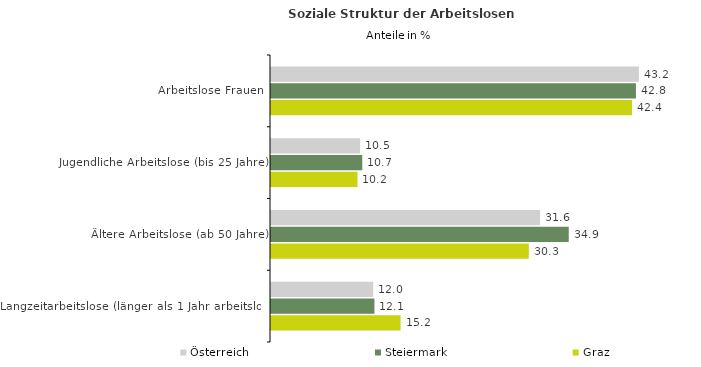
| Category | Österreich | Steiermark | Graz |
|---|---|---|---|
| Arbeitslose Frauen | 43.18 | 42.833 | 42.372 |
| Jugendliche Arbeitslose (bis 25 Jahre) | 10.46 | 10.711 | 10.153 |
| Ältere Arbeitslose (ab 50 Jahre) | 31.584 | 34.947 | 30.26 |
| Langzeitarbeitslose (länger als 1 Jahr arbeitslos) | 11.999 | 12.142 | 15.209 |